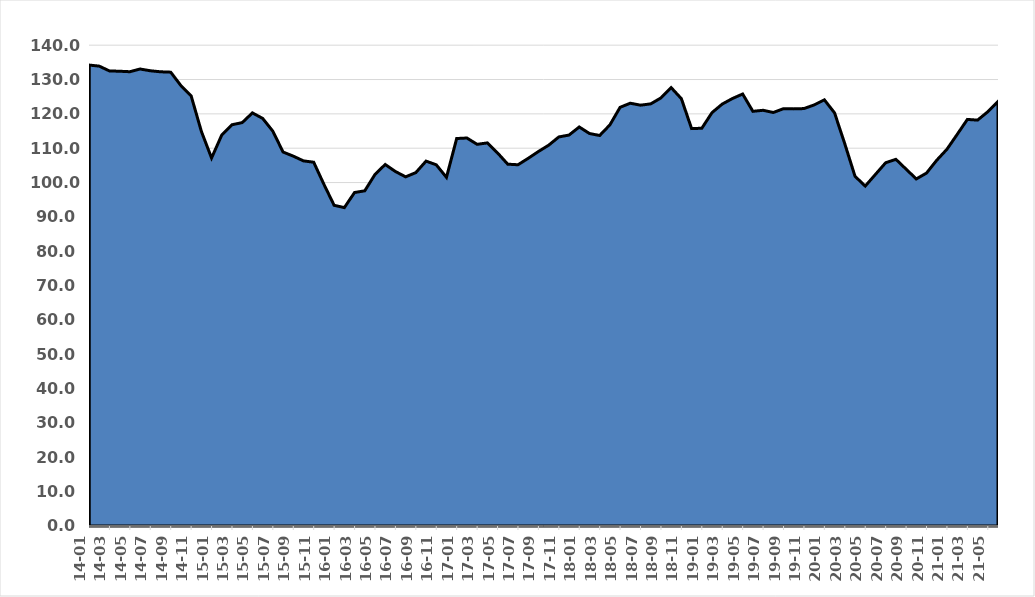
| Category | Series 0 |
|---|---|
| 2014-01-01 | 134.21 |
| 2014-02-01 | 133.9 |
| 2014-03-01 | 132.5 |
| 2014-04-01 | 132.41 |
| 2014-05-01 | 132.27 |
| 2014-06-01 | 133.06 |
| 2014-07-01 | 132.55 |
| 2014-08-01 | 132.25 |
| 2014-09-01 | 132.14 |
| 2014-10-01 | 128.23 |
| 2014-11-01 | 125.26 |
| 2014-12-01 | 114.92 |
| 2015-01-01 | 107.15 |
| 2015-02-01 | 113.85 |
| 2015-03-01 | 116.83 |
| 2015-04-01 | 117.45 |
| 2015-05-01 | 120.28 |
| 2015-06-01 | 118.68 |
| 2015-07-01 | 114.96 |
| 2015-08-01 | 108.89 |
| 2015-09-01 | 107.69 |
| 2015-10-01 | 106.31 |
| 2015-11-01 | 105.92 |
| 2015-12-01 | 99.49 |
| 2016-01-01 | 93.38 |
| 2016-02-01 | 92.7 |
| 2016-03-01 | 97.1 |
| 2016-04-01 | 97.6 |
| 2016-05-01 | 102.35 |
| 2016-06-01 | 105.26 |
| 2016-07-01 | 103.22 |
| 2016-08-01 | 101.66 |
| 2016-09-01 | 102.9 |
| 2016-10-01 | 106.24 |
| 2016-11-01 | 105.17 |
| 2016-12-01 | 101.51 |
| 2017-01-01 | 112.82 |
| 2017-02-01 | 112.97 |
| 2017-03-01 | 111.13 |
| 2017-04-01 | 111.54 |
| 2017-05-01 | 108.63 |
| 2017-06-01 | 105.35 |
| 2017-07-01 | 105.18 |
| 2017-08-01 | 107.05 |
| 2017-09-01 | 109.04 |
| 2017-10-01 | 110.86 |
| 2017-11-01 | 113.28 |
| 2017-12-01 | 113.83 |
| 2018-01-01 | 116.18 |
| 2018-02-01 | 114.28 |
| 2018-03-01 | 113.7 |
| 2018-04-01 | 116.79 |
| 2018-05-01 | 121.91 |
| 2018-06-01 | 123.1 |
| 2018-07-01 | 122.53 |
| 2018-08-01 | 122.91 |
| 2018-09-01 | 124.64 |
| 2018-10-01 | 127.64 |
| 2018-11-01 | 124.42 |
| 2018-12-01 | 115.71 |
| 2019-01-01 | 115.81 |
| 2019-02-01 | 120.36 |
| 2019-03-01 | 122.85 |
| 2019-04-01 | 124.47 |
| 2019-05-01 | 125.78 |
| 2019-06-01 | 120.74 |
| 2019-07-01 | 121.04 |
| 2019-08-01 | 120.4 |
| 2019-09-01 | 121.51 |
| 2019-10-01 | 121.45 |
| 2019-11-01 | 121.54 |
| 2019-12-01 | 122.6 |
| 2020-01-01 | 124.09 |
| 2020-02-01 | 120.27 |
| 2020-03-01 | 111.28 |
| 2020-04-01 | 101.83 |
| 2020-05-01 | 98.97 |
| 2020-06-01 | 102.37 |
| 2020-07-01 | 105.77 |
| 2020-08-01 | 106.77 |
| 2020-09-01 | 103.91 |
| 2020-10-01 | 101.05 |
| 2020-11-01 | 102.76 |
| 2020-12-01 | 106.49 |
| 2021-01-01 | 109.69 |
| 2021-02-01 | 114 |
| 2021-03-01 | 118.38 |
| 2021-04-01 | 118.18 |
| 2021-05-01 | 120.61 |
| 2021-06-01 | 123.6 |